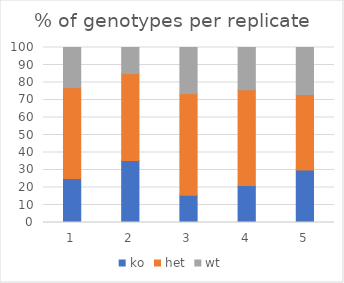
| Category | ko | het | wt |
|---|---|---|---|
| 0 | 25.108 | 51.948 | 22.944 |
| 1 | 35.404 | 49.689 | 14.907 |
| 2 | 15.541 | 58.108 | 26.351 |
| 3 | 21.141 | 54.698 | 24.161 |
| 4 | 30.04 | 43.083 | 26.877 |